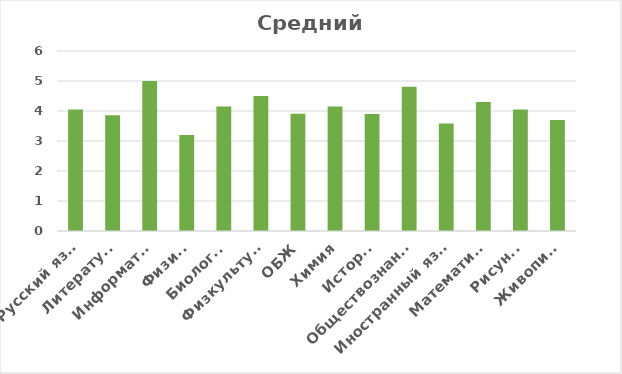
| Category | Средний балл |
|---|---|
| Русский язык  | 4.05 |
| Литература | 3.86 |
| Информатка | 5 |
| Физика | 3.2 |
| Биология | 4.15 |
| Физкультура | 4.5 |
| ОБЖ | 3.91 |
| Химия | 4.15 |
| История | 3.9 |
| Обществознание | 4.81 |
| Иностранный язык | 3.58 |
| Математика | 4.3 |
| Рисунок | 4.05 |
| Живопись | 3.7 |